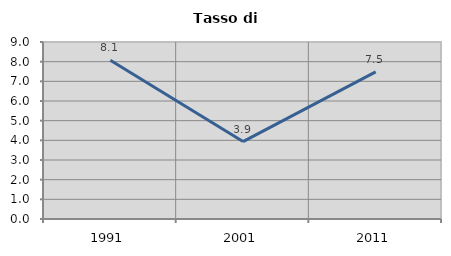
| Category | Tasso di disoccupazione   |
|---|---|
| 1991.0 | 8.07 |
| 2001.0 | 3.936 |
| 2011.0 | 7.481 |